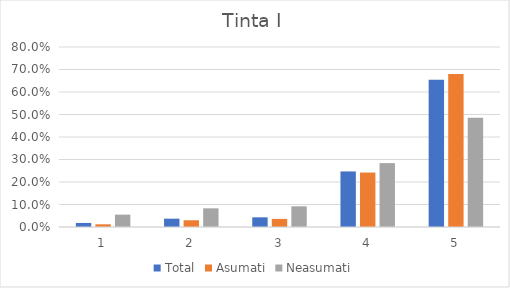
| Category | Total | Asumati | Neasumati |
|---|---|---|---|
| 0 | 0.018 | 0.012 | 0.055 |
| 1 | 0.037 | 0.03 | 0.083 |
| 2 | 0.043 | 0.036 | 0.092 |
| 3 | 0.247 | 0.242 | 0.284 |
| 4 | 0.655 | 0.68 | 0.486 |